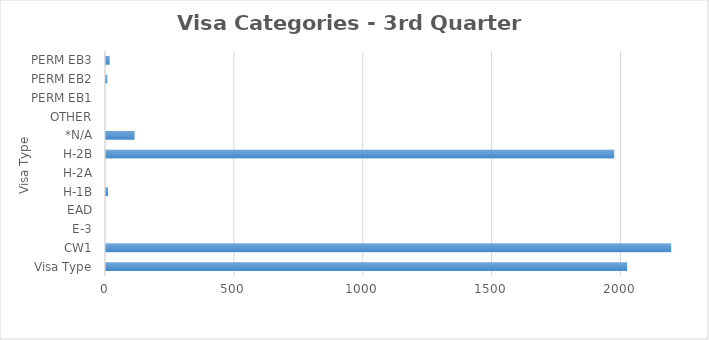
| Category | Series 0 |
|---|---|
| Visa Type | 2022 |
| CW1 | 2193 |
| E-3 | 0 |
| EAD | 0 |
| H-1B | 8 |
| H-2A | 0 |
| H-2B | 1972 |
| *N/A | 111 |
| OTHER | 0 |
| PERM EB1 | 0 |
| PERM EB2 | 5 |
| PERM EB3 | 14 |